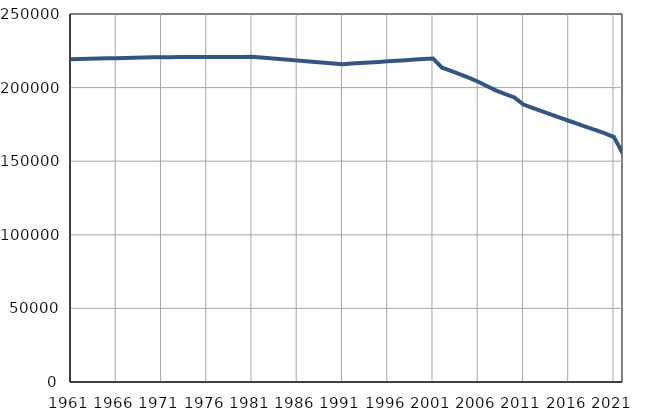
| Category | Број
становника |
|---|---|
| 1961.0 | 219331 |
| 1962.0 | 219465 |
| 1963.0 | 219599 |
| 1964.0 | 219733 |
| 1965.0 | 219867 |
| 1966.0 | 220001 |
| 1967.0 | 220135 |
| 1968.0 | 220269 |
| 1969.0 | 220403 |
| 1970.0 | 220537 |
| 1971.0 | 220671 |
| 1972.0 | 220692 |
| 1973.0 | 220712 |
| 1974.0 | 220733 |
| 1975.0 | 220753 |
| 1976.0 | 220774 |
| 1977.0 | 220794 |
| 1978.0 | 220815 |
| 1979.0 | 220835 |
| 1980.0 | 220856 |
| 1981.0 | 220876 |
| 1982.0 | 220380 |
| 1983.0 | 219884 |
| 1984.0 | 219388 |
| 1985.0 | 218892 |
| 1986.0 | 218396 |
| 1987.0 | 217900 |
| 1988.0 | 217404 |
| 1989.0 | 216908 |
| 1990.0 | 216412 |
| 1991.0 | 215916 |
| 1992.0 | 216305 |
| 1993.0 | 216694 |
| 1994.0 | 217083 |
| 1995.0 | 217472 |
| 1996.0 | 217861 |
| 1997.0 | 218251 |
| 1998.0 | 218640 |
| 1999.0 | 219029 |
| 2000.0 | 219418 |
| 2001.0 | 219807 |
| 2002.0 | 213524 |
| 2003.0 | 211394 |
| 2004.0 | 209057 |
| 2005.0 | 206623 |
| 2006.0 | 203985 |
| 2007.0 | 200951 |
| 2008.0 | 197974 |
| 2009.0 | 195573 |
| 2010.0 | 193331 |
| 2011.0 | 188447 |
| 2012.0 | 186188 |
| 2013.0 | 183967 |
| 2014.0 | 181780 |
| 2015.0 | 179639 |
| 2016.0 | 177476 |
| 2017.0 | 175347 |
| 2018.0 | 173213 |
| 2019.0 | 171054 |
| 2020.0 | 168841 |
| 2021.0 | 166395 |
| 2022.0 | 155104 |